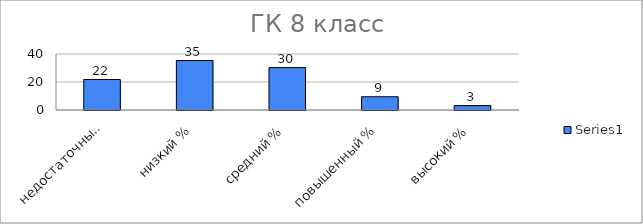
| Category | Series 0 |
|---|---|
| недостаточный % | 21.767 |
| низкий % | 35.331 |
| средний % | 30.284 |
| повышенный % | 9.464 |
| высокий % | 3.155 |